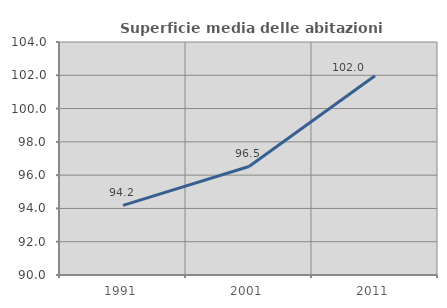
| Category | Superficie media delle abitazioni occupate |
|---|---|
| 1991.0 | 94.18 |
| 2001.0 | 96.523 |
| 2011.0 | 101.975 |